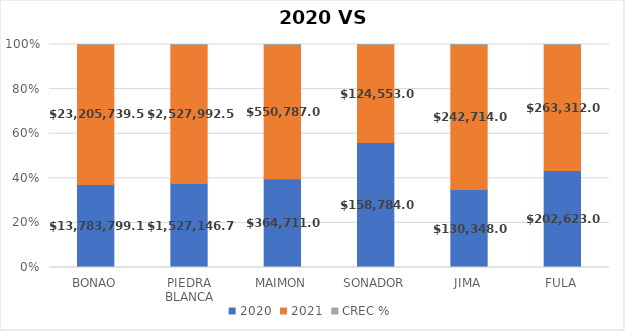
| Category | 2020 | 2021 | CREC % |
|---|---|---|---|
| BONAO | 13783799.11 | 23205739.59 | 1.684 |
| PIEDRA BLANCA | 1527146.71 | 2527992.55 | 1.655 |
| MAIMON | 364711 | 550787 | 1.51 |
| SONADOR | 158784 | 124553 | 0.784 |
| JIMA | 130348 | 242714 | 1.862 |
| FULA | 202623 | 263312 | 1.3 |